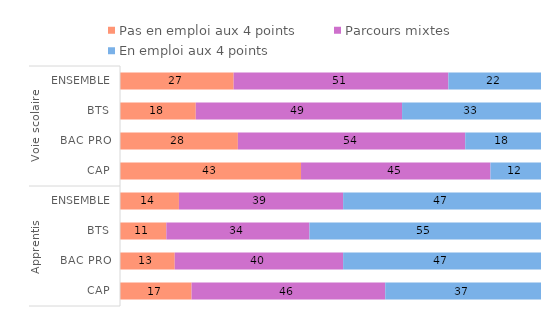
| Category | Pas en emploi aux 4 points | Parcours mixtes | En emploi aux 4 points |
|---|---|---|---|
| 0 | 17 | 46 | 37 |
| 1 | 13 | 40 | 47 |
| 2 | 11 | 34 | 55 |
| 3 | 14 | 39 | 47 |
| 4 | 43 | 45 | 12 |
| 5 | 28 | 54 | 18 |
| 6 | 18 | 49 | 33 |
| 7 | 27 | 51 | 22 |